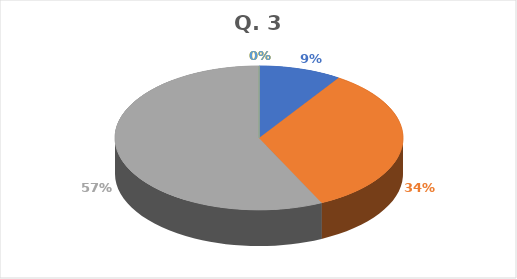
| Category | Series 0 |
|---|---|
| Excellent  | 13 |
| Very Good | 47 |
| Good | 80 |
| Average | 0 |
| Below Average | 0 |